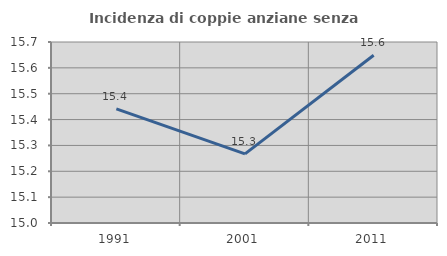
| Category | Incidenza di coppie anziane senza figli  |
|---|---|
| 1991.0 | 15.441 |
| 2001.0 | 15.267 |
| 2011.0 | 15.649 |